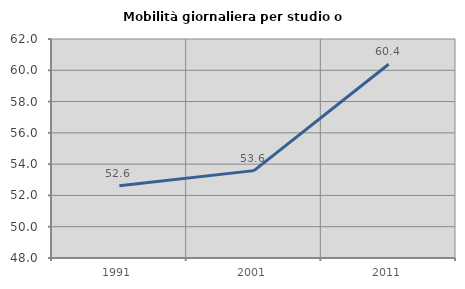
| Category | Mobilità giornaliera per studio o lavoro |
|---|---|
| 1991.0 | 52.613 |
| 2001.0 | 53.585 |
| 2011.0 | 60.386 |